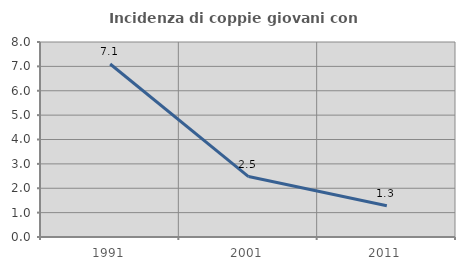
| Category | Incidenza di coppie giovani con figli |
|---|---|
| 1991.0 | 7.097 |
| 2001.0 | 2.479 |
| 2011.0 | 1.282 |